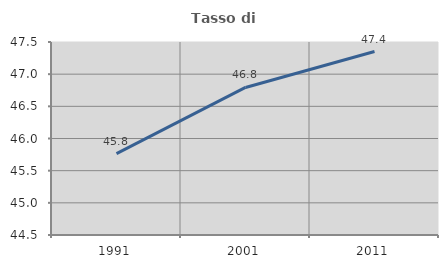
| Category | Tasso di occupazione   |
|---|---|
| 1991.0 | 45.765 |
| 2001.0 | 46.793 |
| 2011.0 | 47.352 |